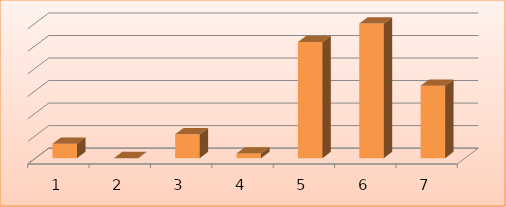
| Category | Series 0 |
|---|---|
| 0 | 3204781 |
| 1 | 0 |
| 2 | 5301306 |
| 3 | 1024554 |
| 4 | 25773050 |
| 5 | 29876082 |
| 6 | 16063328 |